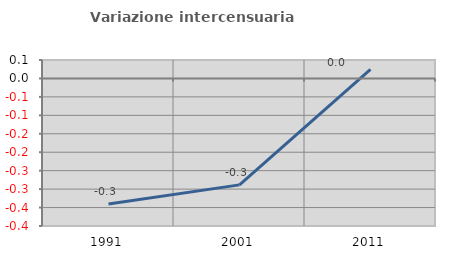
| Category | Variazione intercensuaria annua |
|---|---|
| 1991.0 | -0.34 |
| 2001.0 | -0.289 |
| 2011.0 | 0.024 |